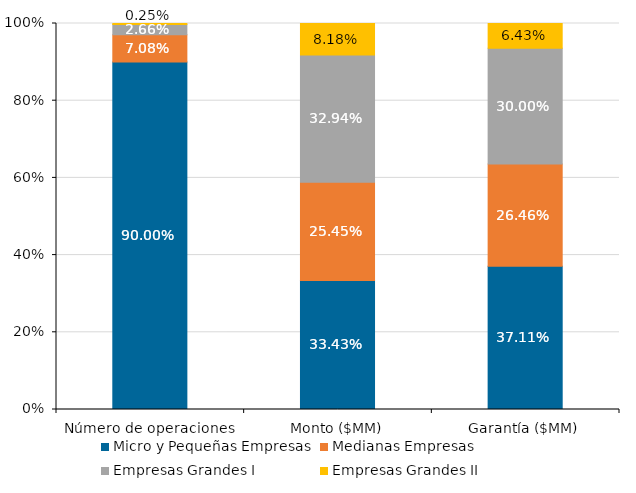
| Category | Micro y Pequeñas Empresas | Medianas Empresas | Empresas Grandes I | Empresas Grandes II |
|---|---|---|---|---|
| Número de operaciones | 0.9 | 0.071 | 0.027 | 0.003 |
| Monto ($MM) | 0.334 | 0.254 | 0.329 | 0.082 |
| Garantía ($MM) | 0.371 | 0.265 | 0.3 | 0.064 |